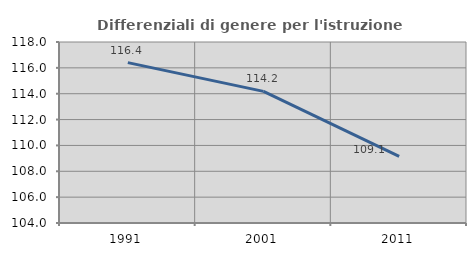
| Category | Differenziali di genere per l'istruzione superiore |
|---|---|
| 1991.0 | 116.406 |
| 2001.0 | 114.182 |
| 2011.0 | 109.148 |